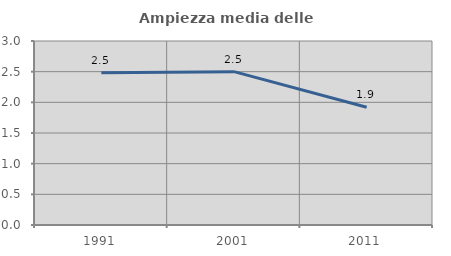
| Category | Ampiezza media delle famiglie |
|---|---|
| 1991.0 | 2.482 |
| 2001.0 | 2.5 |
| 2011.0 | 1.919 |